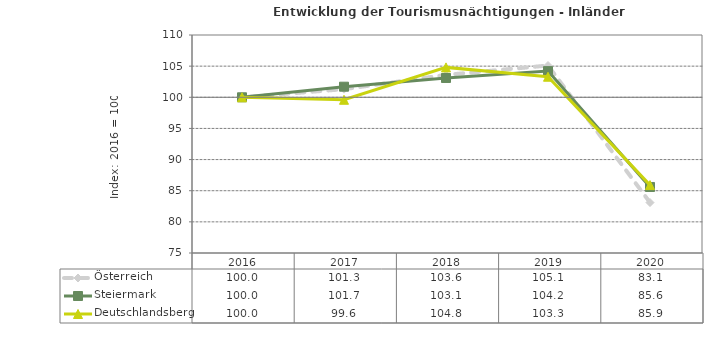
| Category | Österreich | Steiermark | Deutschlandsberg |
|---|---|---|---|
| 2020.0 | 83.1 | 85.6 | 85.9 |
| 2019.0 | 105.1 | 104.2 | 103.3 |
| 2018.0 | 103.6 | 103.1 | 104.8 |
| 2017.0 | 101.3 | 101.7 | 99.6 |
| 2016.0 | 100 | 100 | 100 |